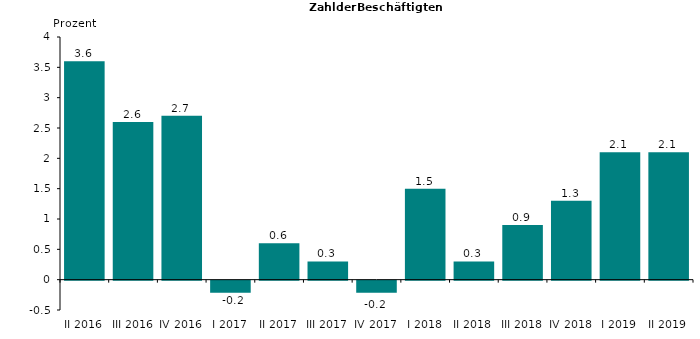
| Category | 3,6 2,6 2,7 -0,2 0,6 0,3 -0,2 1,5 0,3 0,9 1,3 2,1 2,1 |
|---|---|
| II 2016 | 3.6 |
| III 2016 | 2.6 |
| IV 2016 | 2.7 |
| I 2017 | -0.2 |
| II 2017 | 0.6 |
| III 2017 | 0.3 |
| IV 2017 | -0.2 |
| I 2018 | 1.5 |
| II 2018 | 0.3 |
| III 2018 | 0.9 |
| IV 2018 | 1.3 |
| I 2019 | 2.1 |
| II 2019 | 2.1 |